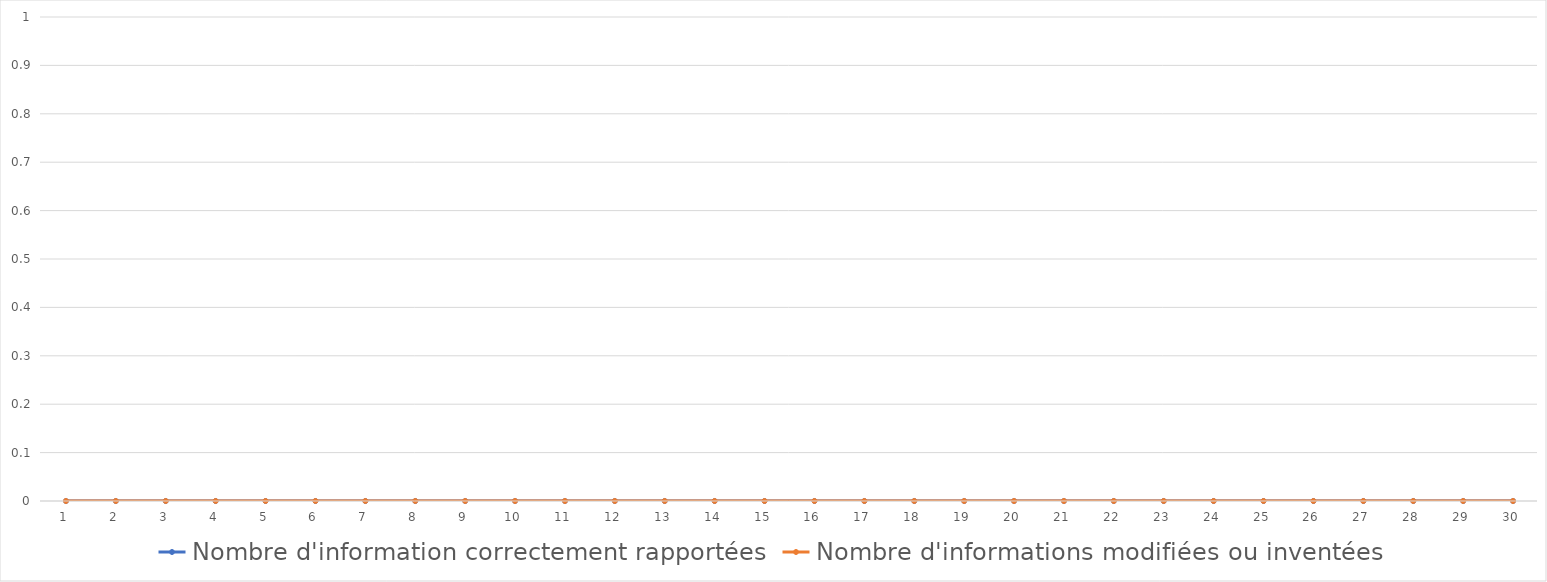
| Category | Nombre d'information correctement rapportées | Nombre d'informations modifiées ou inventées |
|---|---|---|
| 0 | 0 | 0 |
| 1 | 0 | 0 |
| 2 | 0 | 0 |
| 3 | 0 | 0 |
| 4 | 0 | 0 |
| 5 | 0 | 0 |
| 6 | 0 | 0 |
| 7 | 0 | 0 |
| 8 | 0 | 0 |
| 9 | 0 | 0 |
| 10 | 0 | 0 |
| 11 | 0 | 0 |
| 12 | 0 | 0 |
| 13 | 0 | 0 |
| 14 | 0 | 0 |
| 15 | 0 | 0 |
| 16 | 0 | 0 |
| 17 | 0 | 0 |
| 18 | 0 | 0 |
| 19 | 0 | 0 |
| 20 | 0 | 0 |
| 21 | 0 | 0 |
| 22 | 0 | 0 |
| 23 | 0 | 0 |
| 24 | 0 | 0 |
| 25 | 0 | 0 |
| 26 | 0 | 0 |
| 27 | 0 | 0 |
| 28 | 0 | 0 |
| 29 | 0 | 0 |